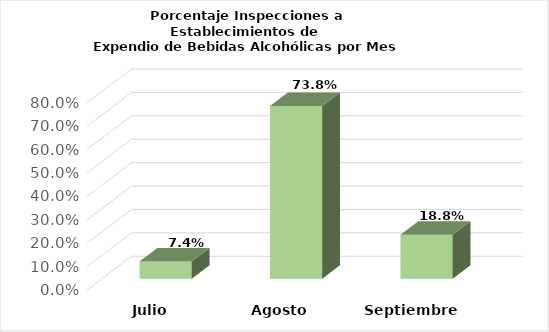
| Category | Series 0 |
|---|---|
| Julio | 0.074 |
| Agosto | 0.738 |
| Septiembre | 0.188 |